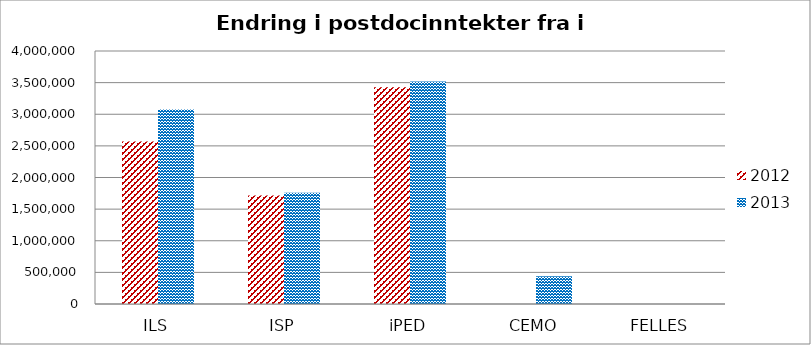
| Category | 2012 | 2013 |
|---|---|---|
| ILS | 2571000 | 3076500 |
| ISP | 1714000 | 1758000 |
| iPED | 3428000 | 3516000 |
| CEMO | 0 | 439500 |
| FELLES | 0 | 0 |